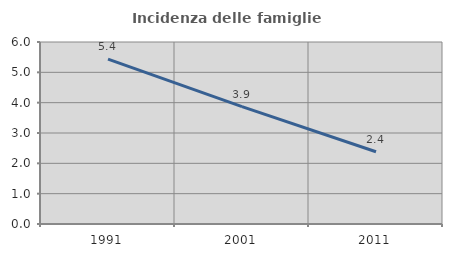
| Category | Incidenza delle famiglie numerose |
|---|---|
| 1991.0 | 5.438 |
| 2001.0 | 3.869 |
| 2011.0 | 2.381 |